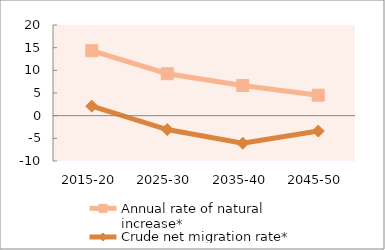
| Category | Annual rate of natural increase* | Crude net migration rate* |
|---|---|---|
| 2015-20 | 14.326 | 2.098 |
| 2025-30 | 9.251 | -3.061 |
| 2035-40 | 6.665 | -6.085 |
| 2045-50 | 4.518 | -3.389 |